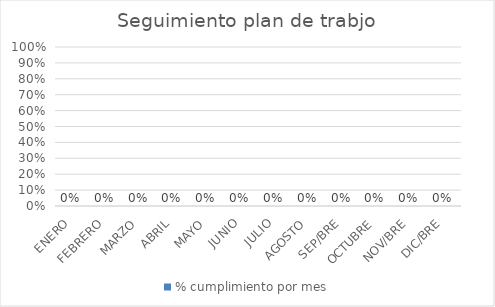
| Category | % cumplimiento por mes |
|---|---|
| ENERO | 0 |
| FEBRERO | 0 |
| MARZO | 0 |
| ABRIL | 0 |
| MAYO | 0 |
| JUNIO | 0 |
| JULIO | 0 |
| AGOSTO | 0 |
| SEP/BRE | 0 |
| OCTUBRE | 0 |
| NOV/BRE | 0 |
| DIC/BRE | 0 |